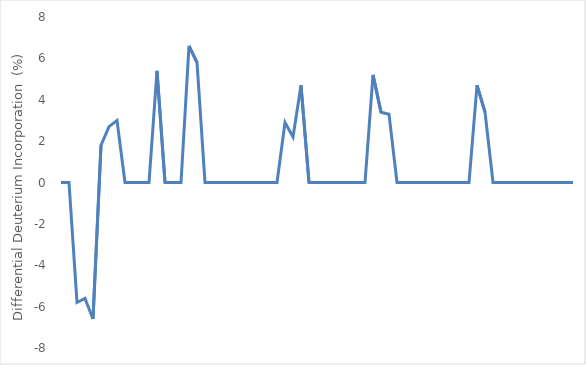
| Category | Series 0 |
|---|---|
| 0 | 0 |
| 1 | 0 |
| 2 | -5.8 |
| 3 | -5.6 |
| 4 | -6.6 |
| 5 | 1.8 |
| 6 | 2.7 |
| 7 | 3 |
| 8 | 0 |
| 9 | 0 |
| 10 | 0 |
| 11 | 0 |
| 12 | 5.4 |
| 13 | 0 |
| 14 | 0 |
| 15 | 0 |
| 16 | 6.6 |
| 17 | 5.8 |
| 18 | 0 |
| 19 | 0 |
| 20 | 0 |
| 21 | 0 |
| 22 | 0 |
| 23 | 0 |
| 24 | 0 |
| 25 | 0 |
| 26 | 0 |
| 27 | 0 |
| 28 | 2.9 |
| 29 | 2.2 |
| 30 | 4.7 |
| 31 | 0 |
| 32 | 0 |
| 33 | 0 |
| 34 | 0 |
| 35 | 0 |
| 36 | 0 |
| 37 | 0 |
| 38 | 0 |
| 39 | 5.2 |
| 40 | 3.4 |
| 41 | 3.3 |
| 42 | 0 |
| 43 | 0 |
| 44 | 0 |
| 45 | 0 |
| 46 | 0 |
| 47 | 0 |
| 48 | 0 |
| 49 | 0 |
| 50 | 0 |
| 51 | 0 |
| 52 | 4.7 |
| 53 | 3.4 |
| 54 | 0 |
| 55 | 0 |
| 56 | 0 |
| 57 | 0 |
| 58 | 0 |
| 59 | 0 |
| 60 | 0 |
| 61 | 0 |
| 62 | 0 |
| 63 | 0 |
| 64 | 0 |